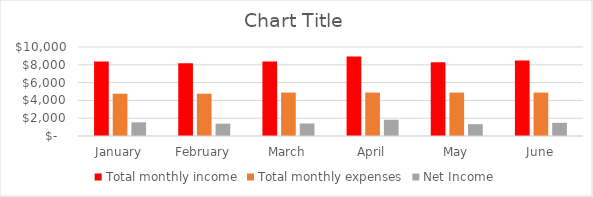
| Category | Total monthly income | Total monthly expenses | Net Income |
|---|---|---|---|
| January | 8380 | 4750 | 1535 |
| February | 8178 | 4750 | 1383.5 |
| March | 8380 | 4880 | 1405 |
| April | 8940 | 4880 | 1825 |
| May | 8280 | 4880 | 1330 |
| June | 8480 | 4880 | 1480 |